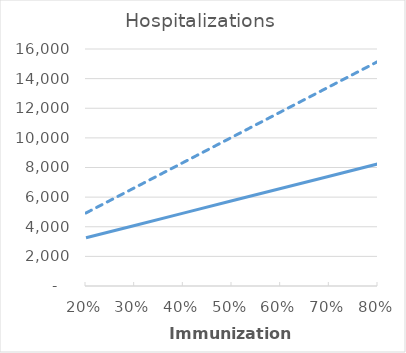
| Category | Low Efficacy, Low RSV Rates | High Efficacy, High RSV Rates |
|---|---|---|
| 0.2 | 3258.529 | 4931.269 |
| 0.30000000000000004 | 4089.444 | 6636.128 |
| 0.4 | 4920.36 | 8340.987 |
| 0.5 | 5751.276 | 10045.845 |
| 0.6 | 6582.192 | 11750.704 |
| 0.7 | 7413.107 | 13455.563 |
| 0.7999999999999999 | 8244.023 | 15160.422 |